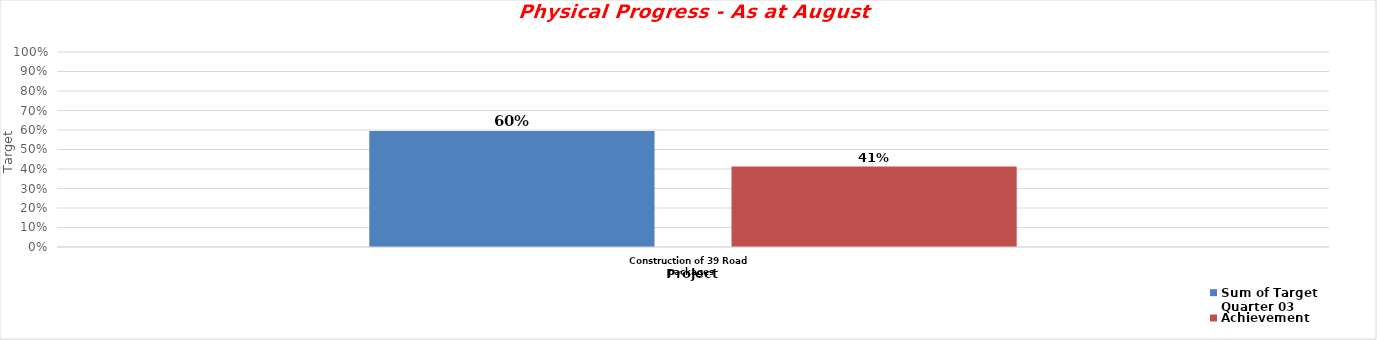
| Category | Sum of Target Quarter 03 | Achievement |
|---|---|---|
| Construction of 39 Road packages | 0.595 | 0.412 |